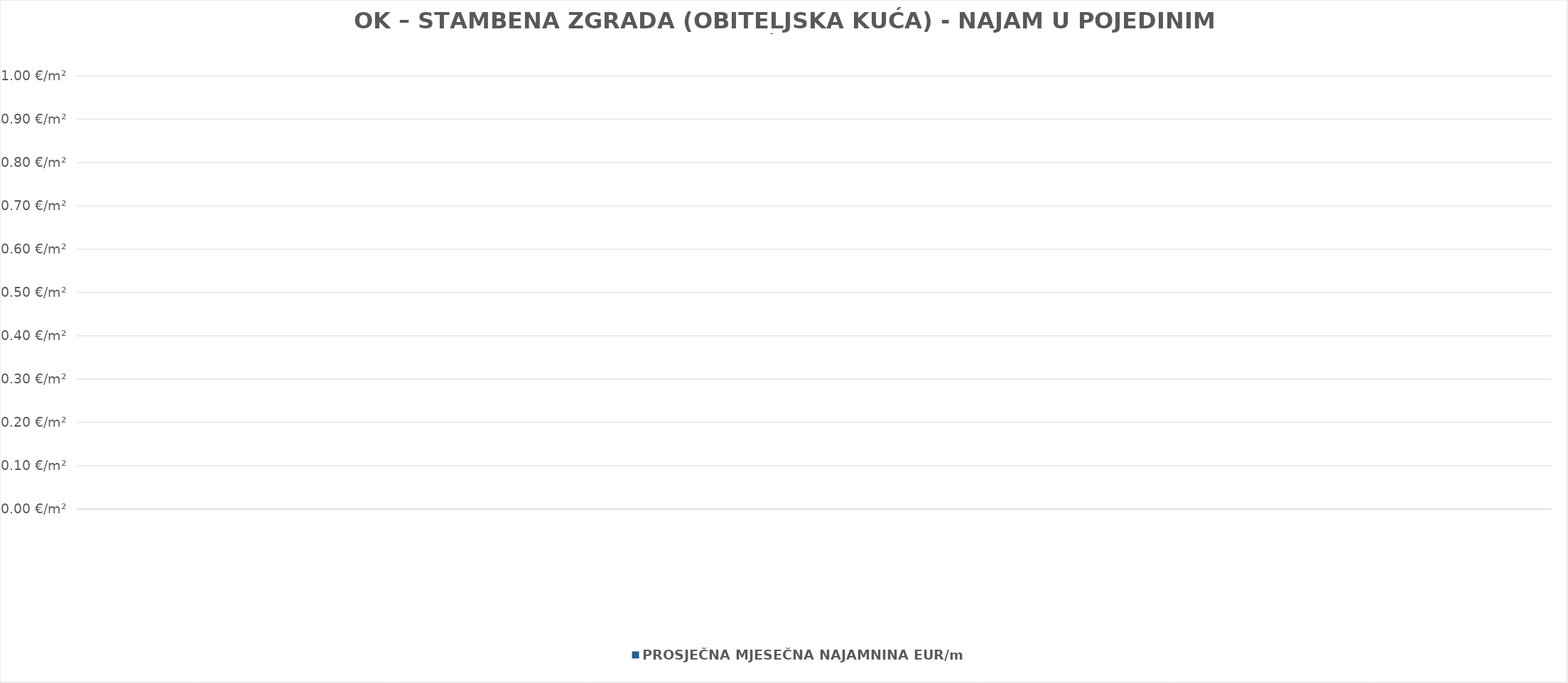
| Category | PROSJEČNA MJESEČNA NAJAMNINA EUR/m2 |
|---|---|
| 0 | 0 |
| 1 | 0 |